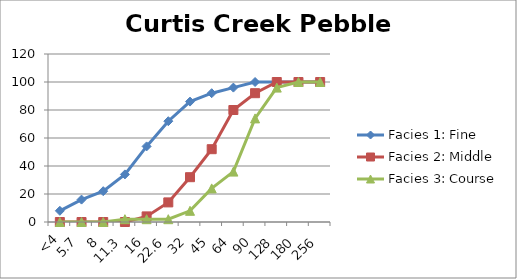
| Category | Facies 1: Fine | Facies 2: Middle | Facies 3: Course |
|---|---|---|---|
| <4 | 8 | 0 | 0 |
| 5.7 | 16 | 0 | 0 |
| 8 | 22 | 0 | 0 |
| 11.3 | 34 | 0 | 2 |
| 16 | 54 | 4 | 2 |
| 22.6 | 72 | 14 | 2 |
| 32 | 86 | 32 | 8 |
| 45 | 92 | 52 | 24 |
| 64 | 96 | 80 | 36 |
| 90 | 100 | 92 | 74 |
| 128 | 100 | 100 | 96 |
| 180 | 100 | 100 | 100 |
| 256 | 100 | 100 | 100 |